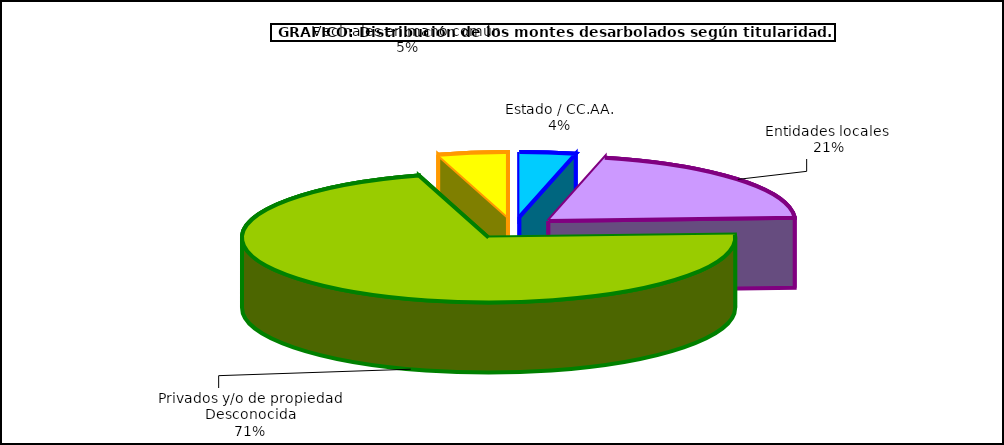
| Category | Series 0 |
|---|---|
| Estado / CC.AA. | 331377.048 |
| Entidades locales  | 1856304.452 |
| Privados y/o de propiedad Desconocida | 6434526.642 |
| Vecinales en mano común  | 412282.758 |